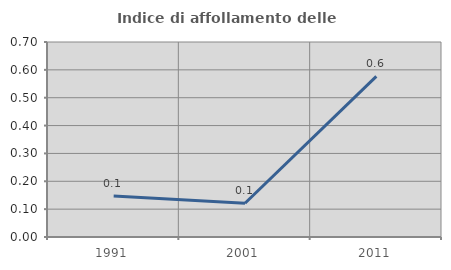
| Category | Indice di affollamento delle abitazioni  |
|---|---|
| 1991.0 | 0.147 |
| 2001.0 | 0.121 |
| 2011.0 | 0.577 |